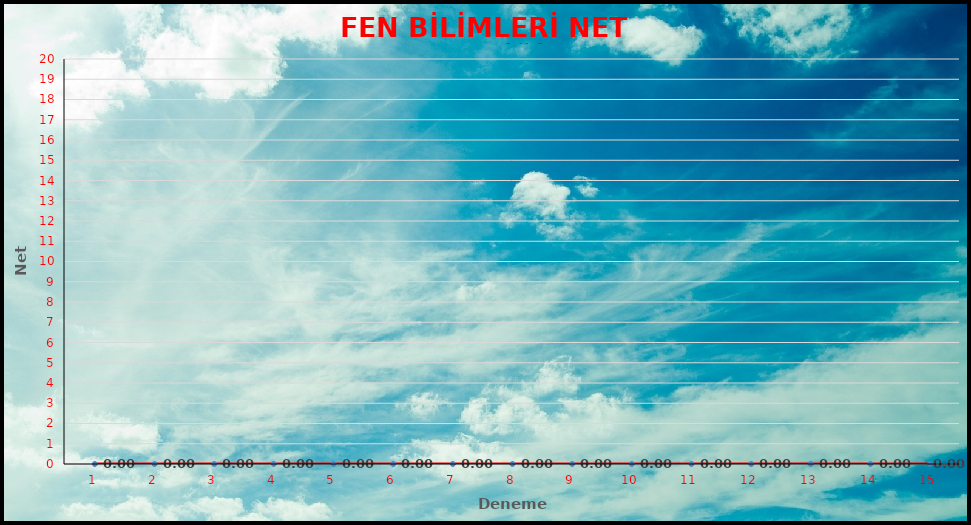
| Category | FEN BİLİMLERİ |
|---|---|
| 0 | 0 |
| 1 | 0 |
| 2 | 0 |
| 3 | 0 |
| 4 | 0 |
| 5 | 0 |
| 6 | 0 |
| 7 | 0 |
| 8 | 0 |
| 9 | 0 |
| 10 | 0 |
| 11 | 0 |
| 12 | 0 |
| 13 | 0 |
| 14 | 0 |